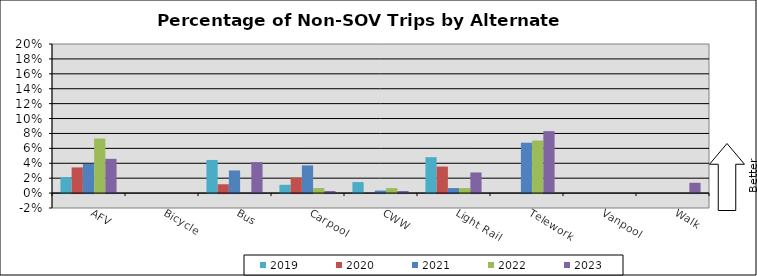
| Category | 2019 | 2020 | 2021 | 2022 | 2023 |
|---|---|---|---|---|---|
| AFV | 0.021 | 0.034 | 0.039 | 0.073 | 0.046 |
| Bicycle | 0 | 0 | 0 | 0 | 0 |
| Bus | 0.044 | 0.012 | 0.03 | 0 | 0.042 |
| Carpool | 0.011 | 0.021 | 0.037 | 0.007 | 0.003 |
| CWW | 0.015 | 0 | 0.003 | 0.007 | 0.003 |
| Light Rail | 0.048 | 0.036 | 0.007 | 0.007 | 0.028 |
| Telework | 0 | 0 | 0.068 | 0.07 | 0.083 |
| Vanpool | 0 | 0 | 0 | 0 | 0 |
| Walk | 0 | 0 | 0 | 0 | 0.014 |